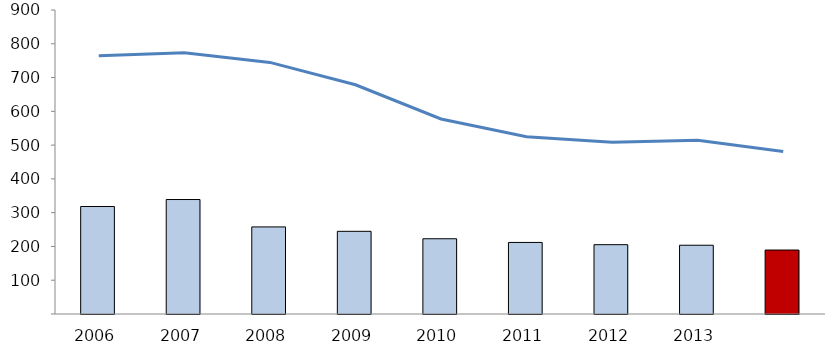
| Category | Current Property Taxes |
|---|---|
| 2006.0 | 318251897.86 |
| 2007.0 | 338924482.32 |
| 2008.0 | 257803650.16 |
| 2009.0 | 244780495.32 |
| 2010.0 | 222738017.09 |
| 2011.0 | 211890533.74 |
| 2012.0 | 205243627.08 |
| 2013.0 | 203613206.7 |